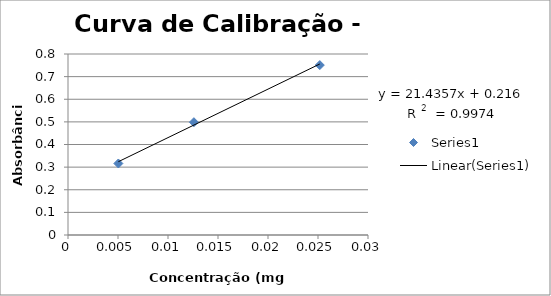
| Category | Series 0 |
|---|---|
| 0.005036 | 0.316 |
| 0.01259 | 0.499 |
| 0.02518 | 0.751 |